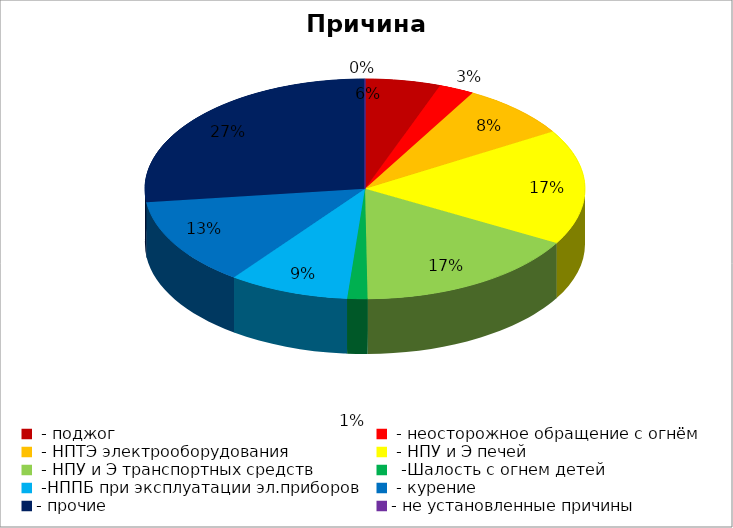
| Category | Причина пожара |
|---|---|
|  - поджог | 15 |
|  - неосторожное обращение с огнём | 7 |
|  - НПТЭ электрооборудования | 22 |
|  - НПУ и Э печей | 46 |
|  - НПУ и Э транспортных средств | 45 |
|   -Шалость с огнем детей | 4 |
|  -НППБ при эксплуатации эл.приборов | 24 |
|  - курение | 35 |
| - прочие | 73 |
| - не установленные причины | 0 |